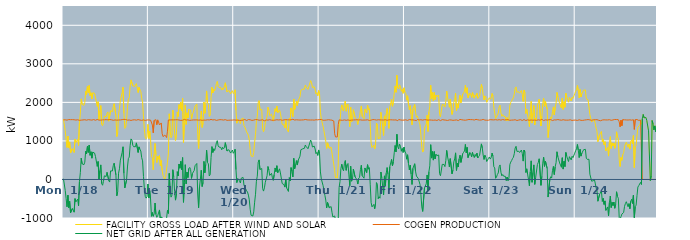
| Category | FACILITY GROSS LOAD AFTER WIND AND SOLAR | COGEN PRODUCTION | NET GRID AFTER ALL GENERATION |
|---|---|---|---|
|  Mon  1/18 | 1564 | 1546 | 18 |
|  Mon  1/18 | 1580 | 1552 | 28 |
|  Mon  1/18 | 1264 | 1547 | -283 |
|  Mon  1/18 | 1041 | 1535 | -494 |
|  Mon  1/18 | 830 | 1539 | -709 |
|  Mon  1/18 | 1127 | 1534 | -407 |
|  Mon  1/18 | 820 | 1554 | -734 |
|  Mon  1/18 | 974 | 1543 | -569 |
|  Mon  1/18 | 685 | 1551 | -866 |
|  Mon  1/18 | 693 | 1546 | -853 |
|  Mon  1/18 | 798 | 1552 | -754 |
|  Mon  1/18 | 811 | 1551 | -740 |
|  Mon  1/18 | 700 | 1549 | -849 |
|  Mon  1/18 | 1042 | 1539 | -497 |
|  Mon  1/18 | 962 | 1541 | -579 |
|  Mon  1/18 | 947 | 1542 | -595 |
|  Mon  1/18 | 1037 | 1548 | -511 |
|  Mon  1/18 | 882 | 1566 | -684 |
|  Mon  1/18 | 1479 | 1534 | -55 |
|  Mon  1/18 | 1721 | 1544 | 177 |
|  Mon  1/18 | 2091 | 1539 | 552 |
|  Mon  1/18 | 1954 | 1548 | 406 |
|  Mon  1/18 | 1949 | 1544 | 405 |
|  Mon  1/18 | 1921 | 1539 | 382 |
|  Mon  1/18 | 1998 | 1549 | 449 |
|  Mon  1/18 | 2291 | 1559 | 732 |
|  Mon  1/18 | 2206 | 1538 | 668 |
|  Mon  1/18 | 2412 | 1553 | 859 |
|  Mon  1/18 | 2252 | 1551 | 701 |
|  Mon  1/18 | 2441 | 1548 | 893 |
|  Mon  1/18 | 2171 | 1545 | 626 |
|  Mon  1/18 | 2249 | 1530 | 719 |
|  Mon  1/18 | 2092 | 1540 | 552 |
|  Mon  1/18 | 2248 | 1538 | 710 |
|  Mon  1/18 | 2256 | 1553 | 703 |
|  Mon  1/18 | 2234 | 1549 | 685 |
|  Mon  1/18 | 2134 | 1536 | 598 |
|  Mon  1/18 | 2120 | 1543 | 577 |
|  Mon  1/18 | 1896 | 1556 | 340 |
|  Mon  1/18 | 2016 | 1551 | 465 |
|  Mon  1/18 | 1550 | 1539 | 11 |
|  Mon  1/18 | 1777 | 1545 | 232 |
|  Mon  1/18 | 1917 | 1539 | 378 |
|  Mon  1/18 | 1432 | 1538 | -106 |
|  Mon  1/18 | 1395 | 1545 | -150 |
|  Mon  1/18 | 1483 | 1533 | -50 |
|  Mon  1/18 | 1642 | 1548 | 94 |
|  Mon  1/18 | 1631 | 1539 | 92 |
|  Mon  1/18 | 1628 | 1551 | 77 |
|  Mon  1/18 | 1715 | 1530 | 185 |
|  Mon  1/18 | 1752 | 1546 | 206 |
|  Mon  1/18 | 1511 | 1541 | -30 |
|  Mon  1/18 | 1487 | 1555 | -68 |
|  Mon  1/18 | 1785 | 1563 | 222 |
|  Mon  1/18 | 1769 | 1548 | 221 |
|  Mon  1/18 | 1756 | 1537 | 219 |
|  Mon  1/18 | 1890 | 1535 | 355 |
|  Mon  1/18 | 1966 | 1544 | 422 |
|  Mon  1/18 | 1977 | 1544 | 433 |
|  Mon  1/18 | 1655 | 1536 | 119 |
|  Mon  1/18 | 1113 | 1538 | -425 |
|  Mon  1/18 | 1227 | 1546 | -319 |
|  Mon  1/18 | 1704 | 1542 | 162 |
|  Mon  1/18 | 1835 | 1558 | 277 |
|  Mon  1/18 | 2045 | 1544 | 501 |
|  Mon  1/18 | 2049 | 1539 | 510 |
|  Mon  1/18 | 2251 | 1551 | 700 |
|  Mon  1/18 | 2395 | 1547 | 848 |
|  Mon  1/18 | 1717 | 1559 | 158 |
|  Mon  1/18 | 1324 | 1544 | -220 |
|  Mon  1/18 | 1353 | 1555 | -202 |
|  Mon  1/18 | 1529 | 1539 | -10 |
|  Mon  1/18 | 1863 | 1539 | 324 |
|  Mon  1/18 | 2084 | 1543 | 541 |
|  Mon  1/18 | 2123 | 1543 | 580 |
|  Mon  1/18 | 2427 | 1549 | 878 |
|  Mon  1/18 | 2583 | 1531 | 1052 |
|  Mon  1/18 | 2564 | 1541 | 1023 |
|  Mon  1/18 | 2430 | 1544 | 886 |
|  Mon  1/18 | 2410 | 1561 | 849 |
|  Mon  1/18 | 2411 | 1548 | 863 |
|  Mon  1/18 | 2401 | 1551 | 850 |
|  Mon  1/18 | 2487 | 1538 | 949 |
|  Mon  1/18 | 2469 | 1542 | 927 |
|  Mon  1/18 | 2254 | 1553 | 701 |
|  Mon  1/18 | 2390 | 1545 | 845 |
|  Mon  1/18 | 2321 | 1541 | 780 |
|  Mon  1/18 | 2283 | 1545 | 738 |
|  Mon  1/18 | 2100 | 1534 | 566 |
|  Mon  1/18 | 2013 | 1531 | 482 |
|  Mon  1/18 | 1624 | 1545 | 79 |
|  Mon  1/18 | 1299 | 1540 | -241 |
|  Mon  1/18 | 1092 | 1532 | -440 |
|  Mon  1/18 | 1056 | 1541 | -485 |
|  Mon  1/18 | 1098 | 1543 | -445 |
|  Mon  1/18 | 1429 | 1547 | -118 |
|  Tue  1/19 | 1063 | 1544 | -481 |
|  Tue  1/19 | 1255 | 1547 | -292 |
|  Tue  1/19 | 1011 | 1538 | -527 |
|  Tue  1/19 | 592 | 1548 | -956 |
|  Tue  1/19 | 554 | 1412 | -858 |
|  Tue  1/19 | 255 | 1211 | -956 |
|  Tue  1/19 | 641 | 1532 | -891 |
|  Tue  1/19 | 934 | 1545 | -611 |
|  Tue  1/19 | 646 | 1551 | -905 |
|  Tue  1/19 | 439 | 1421 | -982 |
|  Tue  1/19 | 606 | 1546 | -940 |
|  Tue  1/19 | 525 | 1490 | -965 |
|  Tue  1/19 | 622 | 1413 | -791 |
|  Tue  1/19 | 358 | 1408 | -1050 |
|  Tue  1/19 | 492 | 1466 | -974 |
|  Tue  1/19 | 231 | 1191 | -960 |
|  Tue  1/19 | 99 | 1111 | -1012 |
|  Tue  1/19 | 82 | 1092 | -1010 |
|  Tue  1/19 | -5 | 1152 | -1157 |
|  Tue  1/19 | 82 | 1123 | -1041 |
|  Tue  1/19 | 92 | 1088 | -996 |
|  Tue  1/19 | 450 | 1251 | -801 |
|  Tue  1/19 | 662 | 1543 | -881 |
|  Tue  1/19 | 1703 | 1546 | 157 |
|  Tue  1/19 | 1265 | 1544 | -279 |
|  Tue  1/19 | 1084 | 1543 | -459 |
|  Tue  1/19 | 1136 | 1545 | -409 |
|  Tue  1/19 | 1800 | 1548 | 252 |
|  Tue  1/19 | 1614 | 1545 | 69 |
|  Tue  1/19 | 1229 | 1537 | -308 |
|  Tue  1/19 | 1011 | 1548 | -537 |
|  Tue  1/19 | 1175 | 1552 | -377 |
|  Tue  1/19 | 1752 | 1549 | 203 |
|  Tue  1/19 | 1634 | 1543 | 91 |
|  Tue  1/19 | 1943 | 1542 | 401 |
|  Tue  1/19 | 1832 | 1541 | 291 |
|  Tue  1/19 | 2003 | 1532 | 471 |
|  Tue  1/19 | 1784 | 1531 | 253 |
|  Tue  1/19 | 2104 | 1537 | 567 |
|  Tue  1/19 | 957 | 1550 | -593 |
|  Tue  1/19 | 1468 | 1558 | -90 |
|  Tue  1/19 | 1934 | 1551 | 383 |
|  Tue  1/19 | 1428 | 1541 | -113 |
|  Tue  1/19 | 1730 | 1539 | 191 |
|  Tue  1/19 | 1595 | 1546 | 49 |
|  Tue  1/19 | 1822 | 1540 | 282 |
|  Tue  1/19 | 1843 | 1532 | 311 |
|  Tue  1/19 | 1803 | 1545 | 258 |
|  Tue  1/19 | 1565 | 1538 | 27 |
|  Tue  1/19 | 1691 | 1543 | 148 |
|  Tue  1/19 | 1739 | 1544 | 195 |
|  Tue  1/19 | 1753 | 1524 | 229 |
|  Tue  1/19 | 1901 | 1544 | 357 |
|  Tue  1/19 | 1910 | 1539 | 371 |
|  Tue  1/19 | 1959 | 1545 | 414 |
|  Tue  1/19 | 1171 | 1549 | -378 |
|  Tue  1/19 | 804 | 1538 | -734 |
|  Tue  1/19 | 1339 | 1534 | -195 |
|  Tue  1/19 | 1553 | 1543 | 10 |
|  Tue  1/19 | 1777 | 1539 | 238 |
|  Tue  1/19 | 1351 | 1534 | -183 |
|  Tue  1/19 | 1457 | 1536 | -79 |
|  Tue  1/19 | 2009 | 1540 | 469 |
|  Tue  1/19 | 1715 | 1542 | 173 |
|  Tue  1/19 | 1930 | 1538 | 392 |
|  Tue  1/19 | 2297 | 1537 | 760 |
|  Tue  1/19 | 1990 | 1548 | 442 |
|  Tue  1/19 | 1951 | 1549 | 402 |
|  Tue  1/19 | 1634 | 1543 | 91 |
|  Tue  1/19 | 1669 | 1545 | 124 |
|  Tue  1/19 | 2123 | 1557 | 566 |
|  Tue  1/19 | 2398 | 1546 | 852 |
|  Tue  1/19 | 2244 | 1544 | 700 |
|  Tue  1/19 | 2339 | 1543 | 796 |
|  Tue  1/19 | 2301 | 1550 | 751 |
|  Tue  1/19 | 2375 | 1541 | 834 |
|  Tue  1/19 | 2486 | 1533 | 953 |
|  Tue  1/19 | 2545 | 1539 | 1006 |
|  Tue  1/19 | 2414 | 1543 | 871 |
|  Tue  1/19 | 2382 | 1542 | 840 |
|  Tue  1/19 | 2388 | 1551 | 837 |
|  Tue  1/19 | 2386 | 1555 | 831 |
|  Tue  1/19 | 2319 | 1549 | 770 |
|  Tue  1/19 | 2369 | 1534 | 835 |
|  Tue  1/19 | 2337 | 1541 | 796 |
|  Tue  1/19 | 2358 | 1535 | 823 |
|  Tue  1/19 | 2508 | 1552 | 956 |
|  Tue  1/19 | 2514 | 1558 | 956 |
|  Tue  1/19 | 2271 | 1534 | 737 |
|  Tue  1/19 | 2266 | 1554 | 712 |
|  Tue  1/19 | 2309 | 1537 | 772 |
|  Tue  1/19 | 2303 | 1543 | 760 |
|  Tue  1/19 | 2224 | 1539 | 685 |
|  Tue  1/19 | 2268 | 1545 | 723 |
|  Tue  1/19 | 2303 | 1540 | 763 |
|  Tue  1/19 | 2228 | 1549 | 679 |
|  Wed  1/20 | 2260 | 1545 | 715 |
|  Wed  1/20 | 2326 | 1542 | 784 |
|  Wed  1/20 | 1794 | 1539 | 255 |
|  Wed  1/20 | 1458 | 1540 | -82 |
|  Wed  1/20 | 1561 | 1539 | 22 |
|  Wed  1/20 | 1586 | 1556 | 30 |
|  Wed  1/20 | 1496 | 1533 | -37 |
|  Wed  1/20 | 1446 | 1538 | -92 |
|  Wed  1/20 | 1566 | 1532 | 34 |
|  Wed  1/20 | 1584 | 1544 | 40 |
|  Wed  1/20 | 1593 | 1540 | 53 |
|  Wed  1/20 | 1392 | 1537 | -145 |
|  Wed  1/20 | 1361 | 1556 | -195 |
|  Wed  1/20 | 1366 | 1554 | -188 |
|  Wed  1/20 | 1233 | 1529 | -296 |
|  Wed  1/20 | 1210 | 1537 | -327 |
|  Wed  1/20 | 1147 | 1553 | -406 |
|  Wed  1/20 | 1026 | 1553 | -527 |
|  Wed  1/20 | 776 | 1548 | -772 |
|  Wed  1/20 | 614 | 1542 | -928 |
|  Wed  1/20 | 616 | 1532 | -916 |
|  Wed  1/20 | 590 | 1538 | -948 |
|  Wed  1/20 | 699 | 1540 | -841 |
|  Wed  1/20 | 970 | 1560 | -590 |
|  Wed  1/20 | 1171 | 1554 | -383 |
|  Wed  1/20 | 1499 | 1544 | -45 |
|  Wed  1/20 | 1635 | 1551 | 84 |
|  Wed  1/20 | 1989 | 1544 | 445 |
|  Wed  1/20 | 2044 | 1537 | 507 |
|  Wed  1/20 | 1801 | 1543 | 258 |
|  Wed  1/20 | 1803 | 1540 | 263 |
|  Wed  1/20 | 1820 | 1536 | 284 |
|  Wed  1/20 | 1311 | 1548 | -237 |
|  Wed  1/20 | 1237 | 1539 | -302 |
|  Wed  1/20 | 1304 | 1522 | -218 |
|  Wed  1/20 | 1470 | 1545 | -75 |
|  Wed  1/20 | 1455 | 1544 | -89 |
|  Wed  1/20 | 1635 | 1537 | 98 |
|  Wed  1/20 | 1874 | 1539 | 335 |
|  Wed  1/20 | 1793 | 1549 | 244 |
|  Wed  1/20 | 1653 | 1550 | 103 |
|  Wed  1/20 | 1631 | 1544 | 87 |
|  Wed  1/20 | 1695 | 1537 | 158 |
|  Wed  1/20 | 1582 | 1539 | 43 |
|  Wed  1/20 | 1513 | 1535 | -22 |
|  Wed  1/20 | 1671 | 1543 | 128 |
|  Wed  1/20 | 1838 | 1540 | 298 |
|  Wed  1/20 | 1759 | 1556 | 203 |
|  Wed  1/20 | 1905 | 1549 | 356 |
|  Wed  1/20 | 1729 | 1557 | 172 |
|  Wed  1/20 | 1737 | 1543 | 194 |
|  Wed  1/20 | 1804 | 1528 | 276 |
|  Wed  1/20 | 1718 | 1549 | 169 |
|  Wed  1/20 | 1706 | 1548 | 158 |
|  Wed  1/20 | 1430 | 1535 | -105 |
|  Wed  1/20 | 1440 | 1536 | -96 |
|  Wed  1/20 | 1410 | 1545 | -135 |
|  Wed  1/20 | 1338 | 1536 | -198 |
|  Wed  1/20 | 1555 | 1552 | 3 |
|  Wed  1/20 | 1322 | 1542 | -220 |
|  Wed  1/20 | 1325 | 1547 | -222 |
|  Wed  1/20 | 1229 | 1541 | -312 |
|  Wed  1/20 | 1593 | 1545 | 48 |
|  Wed  1/20 | 1520 | 1554 | -34 |
|  Wed  1/20 | 1855 | 1548 | 307 |
|  Wed  1/20 | 1765 | 1548 | 217 |
|  Wed  1/20 | 1626 | 1561 | 65 |
|  Wed  1/20 | 2088 | 1541 | 547 |
|  Wed  1/20 | 1817 | 1541 | 276 |
|  Wed  1/20 | 1915 | 1543 | 372 |
|  Wed  1/20 | 2036 | 1548 | 488 |
|  Wed  1/20 | 1917 | 1543 | 374 |
|  Wed  1/20 | 2041 | 1544 | 497 |
|  Wed  1/20 | 2044 | 1535 | 509 |
|  Wed  1/20 | 2145 | 1541 | 604 |
|  Wed  1/20 | 2314 | 1543 | 771 |
|  Wed  1/20 | 2319 | 1543 | 776 |
|  Wed  1/20 | 2340 | 1546 | 794 |
|  Wed  1/20 | 2347 | 1545 | 802 |
|  Wed  1/20 | 2344 | 1535 | 809 |
|  Wed  1/20 | 2449 | 1556 | 893 |
|  Wed  1/20 | 2401 | 1548 | 853 |
|  Wed  1/20 | 2422 | 1545 | 877 |
|  Wed  1/20 | 2337 | 1540 | 797 |
|  Wed  1/20 | 2412 | 1543 | 869 |
|  Wed  1/20 | 2413 | 1532 | 881 |
|  Wed  1/20 | 2564 | 1542 | 1022 |
|  Wed  1/20 | 2513 | 1551 | 962 |
|  Wed  1/20 | 2385 | 1543 | 842 |
|  Wed  1/20 | 2375 | 1543 | 832 |
|  Wed  1/20 | 2404 | 1539 | 865 |
|  Wed  1/20 | 2331 | 1540 | 791 |
|  Wed  1/20 | 2218 | 1549 | 669 |
|  Wed  1/20 | 2251 | 1549 | 702 |
|  Wed  1/20 | 2170 | 1546 | 624 |
|  Wed  1/20 | 2306 | 1541 | 765 |
|  Thu  1/21 | 2223 | 1555 | 668 |
|  Thu  1/21 | 1744 | 1550 | 194 |
|  Thu  1/21 | 1569 | 1555 | 14 |
|  Thu  1/21 | 1576 | 1547 | 29 |
|  Thu  1/21 | 1374 | 1536 | -162 |
|  Thu  1/21 | 1258 | 1539 | -281 |
|  Thu  1/21 | 1126 | 1537 | -411 |
|  Thu  1/21 | 995 | 1529 | -534 |
|  Thu  1/21 | 805 | 1542 | -737 |
|  Thu  1/21 | 950 | 1546 | -596 |
|  Thu  1/21 | 938 | 1550 | -612 |
|  Thu  1/21 | 811 | 1547 | -736 |
|  Thu  1/21 | 807 | 1543 | -736 |
|  Thu  1/21 | 837 | 1540 | -703 |
|  Thu  1/21 | 687 | 1538 | -851 |
|  Thu  1/21 | 540 | 1514 | -974 |
|  Thu  1/21 | 555 | 1515 | -960 |
|  Thu  1/21 | 238 | 1185 | -947 |
|  Thu  1/21 | 41 | 1102 | -1061 |
|  Thu  1/21 | 70 | 1096 | -1026 |
|  Thu  1/21 | 32 | 1103 | -1071 |
|  Thu  1/21 | 377 | 1420 | -1043 |
|  Thu  1/21 | 1336 | 1546 | -210 |
|  Thu  1/21 | 1482 | 1539 | -57 |
|  Thu  1/21 | 1815 | 1538 | 277 |
|  Thu  1/21 | 1934 | 1539 | 395 |
|  Thu  1/21 | 1805 | 1535 | 270 |
|  Thu  1/21 | 1774 | 1550 | 224 |
|  Thu  1/21 | 1966 | 1546 | 420 |
|  Thu  1/21 | 2035 | 1545 | 490 |
|  Thu  1/21 | 1771 | 1534 | 237 |
|  Thu  1/21 | 1933 | 1554 | 379 |
|  Thu  1/21 | 1959 | 1545 | 414 |
|  Thu  1/21 | 1654 | 1536 | 118 |
|  Thu  1/21 | 1370 | 1533 | -163 |
|  Thu  1/21 | 1880 | 1538 | 342 |
|  Thu  1/21 | 1494 | 1540 | -46 |
|  Thu  1/21 | 1545 | 1550 | -5 |
|  Thu  1/21 | 1812 | 1543 | 269 |
|  Thu  1/21 | 1826 | 1548 | 278 |
|  Thu  1/21 | 1611 | 1545 | 66 |
|  Thu  1/21 | 1592 | 1540 | 52 |
|  Thu  1/21 | 1542 | 1549 | -7 |
|  Thu  1/21 | 1427 | 1546 | -119 |
|  Thu  1/21 | 1571 | 1543 | 28 |
|  Thu  1/21 | 1610 | 1556 | 54 |
|  Thu  1/21 | 1806 | 1546 | 260 |
|  Thu  1/21 | 1907 | 1540 | 367 |
|  Thu  1/21 | 1633 | 1538 | 95 |
|  Thu  1/21 | 1614 | 1541 | 73 |
|  Thu  1/21 | 1573 | 1541 | 32 |
|  Thu  1/21 | 1826 | 1528 | 298 |
|  Thu  1/21 | 1847 | 1542 | 305 |
|  Thu  1/21 | 1722 | 1543 | 179 |
|  Thu  1/21 | 1931 | 1548 | 383 |
|  Thu  1/21 | 1802 | 1535 | 267 |
|  Thu  1/21 | 1838 | 1531 | 307 |
|  Thu  1/21 | 1412 | 1536 | -124 |
|  Thu  1/21 | 941 | 1539 | -598 |
|  Thu  1/21 | 828 | 1539 | -711 |
|  Thu  1/21 | 838 | 1553 | -715 |
|  Thu  1/21 | 889 | 1537 | -648 |
|  Thu  1/21 | 789 | 1550 | -761 |
|  Thu  1/21 | 916 | 1529 | -613 |
|  Thu  1/21 | 1460 | 1540 | -80 |
|  Thu  1/21 | 1413 | 1535 | -122 |
|  Thu  1/21 | 1051 | 1548 | -497 |
|  Thu  1/21 | 1091 | 1541 | -450 |
|  Thu  1/21 | 1059 | 1545 | -486 |
|  Thu  1/21 | 1743 | 1550 | 193 |
|  Thu  1/21 | 1584 | 1543 | 41 |
|  Thu  1/21 | 1574 | 1540 | 34 |
|  Thu  1/21 | 1142 | 1542 | -400 |
|  Thu  1/21 | 1649 | 1556 | 93 |
|  Thu  1/21 | 1387 | 1550 | -163 |
|  Thu  1/21 | 1698 | 1537 | 161 |
|  Thu  1/21 | 1843 | 1535 | 308 |
|  Thu  1/21 | 1684 | 1553 | 131 |
|  Thu  1/21 | 1324 | 1546 | -222 |
|  Thu  1/21 | 1874 | 1545 | 329 |
|  Thu  1/21 | 1859 | 1548 | 311 |
|  Thu  1/21 | 2075 | 1556 | 519 |
|  Thu  1/21 | 1899 | 1545 | 354 |
|  Thu  1/21 | 1996 | 1534 | 462 |
|  Thu  1/21 | 2236 | 1543 | 693 |
|  Thu  1/21 | 2426 | 1545 | 881 |
|  Thu  1/21 | 2261 | 1545 | 716 |
|  Thu  1/21 | 2702 | 1531 | 1171 |
|  Thu  1/21 | 2377 | 1523 | 854 |
|  Thu  1/21 | 2348 | 1555 | 793 |
|  Thu  1/21 | 2458 | 1543 | 915 |
|  Thu  1/21 | 2404 | 1544 | 860 |
|  Thu  1/21 | 2286 | 1553 | 733 |
|  Thu  1/21 | 2341 | 1538 | 803 |
|  Thu  1/21 | 2233 | 1534 | 699 |
|  Thu  1/21 | 2378 | 1540 | 838 |
|  Fri  1/22 | 2262 | 1545 | 717 |
|  Fri  1/22 | 2234 | 1547 | 687 |
|  Fri  1/22 | 2059 | 1533 | 526 |
|  Fri  1/22 | 2171 | 1531 | 640 |
|  Fri  1/22 | 1961 | 1544 | 417 |
|  Fri  1/22 | 1803 | 1555 | 248 |
|  Fri  1/22 | 1914 | 1544 | 370 |
|  Fri  1/22 | 1685 | 1546 | 139 |
|  Fri  1/22 | 1417 | 1547 | -130 |
|  Fri  1/22 | 1834 | 1545 | 289 |
|  Fri  1/22 | 1846 | 1540 | 306 |
|  Fri  1/22 | 1945 | 1537 | 408 |
|  Fri  1/22 | 1739 | 1534 | 205 |
|  Fri  1/22 | 1614 | 1527 | 87 |
|  Fri  1/22 | 1649 | 1555 | 94 |
|  Fri  1/22 | 1572 | 1545 | 27 |
|  Fri  1/22 | 1575 | 1544 | 31 |
|  Fri  1/22 | 1417 | 1548 | -131 |
|  Fri  1/22 | 1153 | 1549 | -396 |
|  Fri  1/22 | 826 | 1539 | -713 |
|  Fri  1/22 | 710 | 1539 | -829 |
|  Fri  1/22 | 738 | 1549 | -811 |
|  Fri  1/22 | 1329 | 1551 | -222 |
|  Fri  1/22 | 1341 | 1539 | -198 |
|  Fri  1/22 | 1433 | 1547 | -114 |
|  Fri  1/22 | 1665 | 1549 | 116 |
|  Fri  1/22 | 1245 | 1539 | -294 |
|  Fri  1/22 | 1754 | 1553 | 201 |
|  Fri  1/22 | 1896 | 1543 | 353 |
|  Fri  1/22 | 2445 | 1543 | 902 |
|  Fri  1/22 | 2094 | 1540 | 554 |
|  Fri  1/22 | 2257 | 1533 | 724 |
|  Fri  1/22 | 2038 | 1536 | 502 |
|  Fri  1/22 | 2257 | 1533 | 724 |
|  Fri  1/22 | 2074 | 1542 | 532 |
|  Fri  1/22 | 2191 | 1539 | 652 |
|  Fri  1/22 | 2152 | 1531 | 621 |
|  Fri  1/22 | 2151 | 1546 | 605 |
|  Fri  1/22 | 2185 | 1552 | 633 |
|  Fri  1/22 | 1681 | 1533 | 148 |
|  Fri  1/22 | 1624 | 1527 | 97 |
|  Fri  1/22 | 1648 | 1541 | 107 |
|  Fri  1/22 | 1944 | 1552 | 392 |
|  Fri  1/22 | 1949 | 1540 | 409 |
|  Fri  1/22 | 1932 | 1544 | 388 |
|  Fri  1/22 | 1877 | 1544 | 333 |
|  Fri  1/22 | 2028 | 1539 | 489 |
|  Fri  1/22 | 2293 | 1540 | 753 |
|  Fri  1/22 | 2118 | 1531 | 587 |
|  Fri  1/22 | 2012 | 1538 | 474 |
|  Fri  1/22 | 1873 | 1545 | 328 |
|  Fri  1/22 | 2086 | 1546 | 540 |
|  Fri  1/22 | 2074 | 1543 | 531 |
|  Fri  1/22 | 1688 | 1541 | 147 |
|  Fri  1/22 | 1775 | 1534 | 241 |
|  Fri  1/22 | 2005 | 1548 | 457 |
|  Fri  1/22 | 2070 | 1538 | 532 |
|  Fri  1/22 | 2236 | 1546 | 690 |
|  Fri  1/22 | 1779 | 1545 | 234 |
|  Fri  1/22 | 1962 | 1537 | 425 |
|  Fri  1/22 | 1851 | 1528 | 323 |
|  Fri  1/22 | 2074 | 1540 | 534 |
|  Fri  1/22 | 2187 | 1558 | 629 |
|  Fri  1/22 | 1991 | 1549 | 442 |
|  Fri  1/22 | 1991 | 1548 | 443 |
|  Fri  1/22 | 2214 | 1545 | 669 |
|  Fri  1/22 | 2244 | 1541 | 703 |
|  Fri  1/22 | 2293 | 1553 | 740 |
|  Fri  1/22 | 2445 | 1537 | 908 |
|  Fri  1/22 | 2237 | 1545 | 692 |
|  Fri  1/22 | 2379 | 1546 | 833 |
|  Fri  1/22 | 2117 | 1550 | 567 |
|  Fri  1/22 | 2136 | 1556 | 580 |
|  Fri  1/22 | 2242 | 1544 | 698 |
|  Fri  1/22 | 2207 | 1552 | 655 |
|  Fri  1/22 | 2131 | 1545 | 586 |
|  Fri  1/22 | 2253 | 1551 | 702 |
|  Fri  1/22 | 2264 | 1541 | 723 |
|  Fri  1/22 | 2109 | 1542 | 567 |
|  Fri  1/22 | 2194 | 1543 | 651 |
|  Fri  1/22 | 2154 | 1559 | 595 |
|  Fri  1/22 | 2237 | 1553 | 684 |
|  Fri  1/22 | 2105 | 1548 | 557 |
|  Fri  1/22 | 2135 | 1538 | 597 |
|  Fri  1/22 | 2168 | 1540 | 628 |
|  Fri  1/22 | 2171 | 1532 | 639 |
|  Fri  1/22 | 2466 | 1543 | 923 |
|  Fri  1/22 | 2374 | 1554 | 820 |
|  Fri  1/22 | 2192 | 1558 | 634 |
|  Fri  1/22 | 2061 | 1542 | 519 |
|  Fri  1/22 | 2168 | 1540 | 628 |
|  Fri  1/22 | 2135 | 1555 | 580 |
|  Fri  1/22 | 2002 | 1537 | 465 |
|  Fri  1/22 | 1986 | 1543 | 443 |
|  Fri  1/22 | 2083 | 1537 | 546 |
|  Fri  1/22 | 2120 | 1537 | 583 |
|  Sat  1/23 | 2080 | 1551 | 529 |
|  Sat  1/23 | 2114 | 1546 | 568 |
|  Sat  1/23 | 2231 | 1547 | 684 |
|  Sat  1/23 | 2162 | 1558 | 604 |
|  Sat  1/23 | 1873 | 1545 | 328 |
|  Sat  1/23 | 1850 | 1550 | 300 |
|  Sat  1/23 | 1581 | 1551 | 30 |
|  Sat  1/23 | 1603 | 1540 | 63 |
|  Sat  1/23 | 1670 | 1541 | 129 |
|  Sat  1/23 | 1724 | 1555 | 169 |
|  Sat  1/23 | 1883 | 1551 | 332 |
|  Sat  1/23 | 1926 | 1549 | 377 |
|  Sat  1/23 | 1724 | 1539 | 185 |
|  Sat  1/23 | 1638 | 1544 | 94 |
|  Sat  1/23 | 1682 | 1555 | 127 |
|  Sat  1/23 | 1639 | 1554 | 85 |
|  Sat  1/23 | 1635 | 1543 | 92 |
|  Sat  1/23 | 1627 | 1547 | 80 |
|  Sat  1/23 | 1521 | 1550 | -29 |
|  Sat  1/23 | 1606 | 1543 | 63 |
|  Sat  1/23 | 1520 | 1551 | -31 |
|  Sat  1/23 | 1583 | 1541 | 42 |
|  Sat  1/23 | 1921 | 1535 | 386 |
|  Sat  1/23 | 1999 | 1549 | 450 |
|  Sat  1/23 | 2030 | 1540 | 490 |
|  Sat  1/23 | 2083 | 1542 | 541 |
|  Sat  1/23 | 2117 | 1542 | 575 |
|  Sat  1/23 | 2213 | 1546 | 667 |
|  Sat  1/23 | 2364 | 1549 | 815 |
|  Sat  1/23 | 2401 | 1541 | 860 |
|  Sat  1/23 | 2257 | 1530 | 727 |
|  Sat  1/23 | 2284 | 1543 | 741 |
|  Sat  1/23 | 2273 | 1541 | 732 |
|  Sat  1/23 | 2243 | 1544 | 699 |
|  Sat  1/23 | 2233 | 1551 | 682 |
|  Sat  1/23 | 2309 | 1546 | 763 |
|  Sat  1/23 | 2202 | 1530 | 672 |
|  Sat  1/23 | 2025 | 1549 | 476 |
|  Sat  1/23 | 2319 | 1555 | 764 |
|  Sat  1/23 | 2253 | 1544 | 709 |
|  Sat  1/23 | 1710 | 1529 | 181 |
|  Sat  1/23 | 1822 | 1546 | 276 |
|  Sat  1/23 | 1677 | 1546 | 131 |
|  Sat  1/23 | 1548 | 1544 | 4 |
|  Sat  1/23 | 1373 | 1537 | -164 |
|  Sat  1/23 | 1746 | 1549 | 197 |
|  Sat  1/23 | 2025 | 1542 | 483 |
|  Sat  1/23 | 1463 | 1536 | -73 |
|  Sat  1/23 | 1718 | 1537 | 181 |
|  Sat  1/23 | 1917 | 1539 | 378 |
|  Sat  1/23 | 1413 | 1540 | -127 |
|  Sat  1/23 | 1593 | 1549 | 44 |
|  Sat  1/23 | 1555 | 1533 | 22 |
|  Sat  1/23 | 1934 | 1548 | 386 |
|  Sat  1/23 | 1991 | 1548 | 443 |
|  Sat  1/23 | 2083 | 1547 | 536 |
|  Sat  1/23 | 2064 | 1537 | 527 |
|  Sat  1/23 | 1388 | 1540 | -152 |
|  Sat  1/23 | 1642 | 1560 | 82 |
|  Sat  1/23 | 1967 | 1544 | 423 |
|  Sat  1/23 | 2105 | 1528 | 577 |
|  Sat  1/23 | 1890 | 1551 | 339 |
|  Sat  1/23 | 2024 | 1546 | 478 |
|  Sat  1/23 | 2046 | 1546 | 500 |
|  Sat  1/23 | 1824 | 1540 | 284 |
|  Sat  1/23 | 1087 | 1543 | -456 |
|  Sat  1/23 | 1086 | 1548 | -462 |
|  Sat  1/23 | 1541 | 1531 | 10 |
|  Sat  1/23 | 1623 | 1552 | 71 |
|  Sat  1/23 | 1582 | 1547 | 35 |
|  Sat  1/23 | 1765 | 1528 | 237 |
|  Sat  1/23 | 1883 | 1546 | 337 |
|  Sat  1/23 | 1673 | 1546 | 127 |
|  Sat  1/23 | 1874 | 1544 | 330 |
|  Sat  1/23 | 1978 | 1543 | 435 |
|  Sat  1/23 | 2258 | 1540 | 718 |
|  Sat  1/23 | 2142 | 1554 | 588 |
|  Sat  1/23 | 2144 | 1551 | 593 |
|  Sat  1/23 | 1972 | 1544 | 428 |
|  Sat  1/23 | 1986 | 1550 | 436 |
|  Sat  1/23 | 1854 | 1537 | 317 |
|  Sat  1/23 | 2110 | 1546 | 564 |
|  Sat  1/23 | 1818 | 1549 | 269 |
|  Sat  1/23 | 2018 | 1546 | 472 |
|  Sat  1/23 | 1873 | 1540 | 333 |
|  Sat  1/23 | 2237 | 1537 | 700 |
|  Sat  1/23 | 2141 | 1538 | 603 |
|  Sat  1/23 | 2067 | 1543 | 524 |
|  Sat  1/23 | 2004 | 1539 | 465 |
|  Sat  1/23 | 2126 | 1535 | 591 |
|  Sat  1/23 | 2131 | 1548 | 583 |
|  Sat  1/23 | 2035 | 1528 | 507 |
|  Sat  1/23 | 2132 | 1530 | 602 |
|  Sat  1/23 | 2104 | 1537 | 567 |
|  Sat  1/23 | 2112 | 1539 | 573 |
|  Sat  1/23 | 2223 | 1541 | 682 |
|  Sun  1/24 | 2285 | 1540 | 745 |
|  Sun  1/24 | 2335 | 1540 | 795 |
|  Sun  1/24 | 2439 | 1531 | 908 |
|  Sun  1/24 | 2304 | 1549 | 755 |
|  Sun  1/24 | 2116 | 1548 | 568 |
|  Sun  1/24 | 2331 | 1550 | 781 |
|  Sun  1/24 | 2139 | 1534 | 605 |
|  Sun  1/24 | 2229 | 1546 | 683 |
|  Sun  1/24 | 2214 | 1533 | 681 |
|  Sun  1/24 | 2316 | 1544 | 772 |
|  Sun  1/24 | 2338 | 1541 | 797 |
|  Sun  1/24 | 2323 | 1542 | 781 |
|  Sun  1/24 | 2096 | 1547 | 549 |
|  Sun  1/24 | 2072 | 1550 | 522 |
|  Sun  1/24 | 2067 | 1553 | 514 |
|  Sun  1/24 | 2058 | 1535 | 523 |
|  Sun  1/24 | 1683 | 1545 | 138 |
|  Sun  1/24 | 1688 | 1546 | 142 |
|  Sun  1/24 | 1490 | 1535 | -45 |
|  Sun  1/24 | 1518 | 1545 | -27 |
|  Sun  1/24 | 1516 | 1548 | -32 |
|  Sun  1/24 | 1552 | 1542 | 10 |
|  Sun  1/24 | 1455 | 1549 | -94 |
|  Sun  1/24 | 1330 | 1546 | -216 |
|  Sun  1/24 | 1255 | 1551 | -296 |
|  Sun  1/24 | 980 | 1545 | -565 |
|  Sun  1/24 | 968 | 1535 | -567 |
|  Sun  1/24 | 1160 | 1540 | -380 |
|  Sun  1/24 | 1151 | 1523 | -372 |
|  Sun  1/24 | 1247 | 1548 | -301 |
|  Sun  1/24 | 972 | 1542 | -570 |
|  Sun  1/24 | 1046 | 1536 | -490 |
|  Sun  1/24 | 899 | 1547 | -648 |
|  Sun  1/24 | 981 | 1537 | -556 |
|  Sun  1/24 | 741 | 1544 | -803 |
|  Sun  1/24 | 789 | 1553 | -764 |
|  Sun  1/24 | 831 | 1544 | -713 |
|  Sun  1/24 | 606 | 1551 | -945 |
|  Sun  1/24 | 957 | 1550 | -593 |
|  Sun  1/24 | 1110 | 1540 | -430 |
|  Sun  1/24 | 805 | 1534 | -729 |
|  Sun  1/24 | 949 | 1542 | -593 |
|  Sun  1/24 | 867 | 1544 | -677 |
|  Sun  1/24 | 946 | 1534 | -588 |
|  Sun  1/24 | 809 | 1556 | -747 |
|  Sun  1/24 | 898 | 1543 | -645 |
|  Sun  1/24 | 1236 | 1555 | -319 |
|  Sun  1/24 | 1104 | 1544 | -440 |
|  Sun  1/24 | 1063 | 1551 | -488 |
|  Sun  1/24 | 510 | 1496 | -986 |
|  Sun  1/24 | 336 | 1366 | -1030 |
|  Sun  1/24 | 571 | 1538 | -967 |
|  Sun  1/24 | 497 | 1395 | -898 |
|  Sun  1/24 | 642 | 1552 | -910 |
|  Sun  1/24 | 697 | 1553 | -856 |
|  Sun  1/24 | 849 | 1547 | -698 |
|  Sun  1/24 | 921 | 1544 | -623 |
|  Sun  1/24 | 966 | 1544 | -578 |
|  Sun  1/24 | 987 | 1547 | -560 |
|  Sun  1/24 | 832 | 1542 | -710 |
|  Sun  1/24 | 918 | 1544 | -626 |
|  Sun  1/24 | 788 | 1546 | -758 |
|  Sun  1/24 | 985 | 1551 | -566 |
|  Sun  1/24 | 1025 | 1538 | -513 |
|  Sun  1/24 | 921 | 1545 | -624 |
|  Sun  1/24 | 1143 | 1549 | -406 |
|  Sun  1/24 | 307 | 1298 | -991 |
|  Sun  1/24 | 848 | 1552 | -704 |
|  Sun  1/24 | 883 | 1550 | -667 |
|  Sun  1/24 | 1134 | 1554 | -420 |
|  Sun  1/24 | 1354 | 1551 | -197 |
|  Sun  1/24 | 1373 | 1532 | -159 |
|  Sun  1/24 | 1408 | 1550 | -142 |
|  Sun  1/24 | 1466 | 1541 | -75 |
|  Sun  1/24 | 1432 | 1562 | -130 |
|  Sun  1/24 | 1574 | 0 | 1574 |
|  Sun  1/24 | 1685 | 0 | 1685 |
|  Sun  1/24 | 1599 | 0 | 1599 |
|  Sun  1/24 | 1607 | 0 | 1607 |
|  Sun  1/24 | 1608 | 0 | 1608 |
|  Sun  1/24 | 1532 | 0 | 1532 |
|  Sun  1/24 | 1548 | 0 | 1548 |
|  Sun  1/24 | 1261 | 0 | 1261 |
|  Sun  1/24 | 1237 | 0 | 1237 |
|  Sun  1/24 | -29 | 0 | -29 |
|  Sun  1/24 | 93 | 0 | 93 |
|  Sun  1/24 | 1529 | 0 | 1529 |
|  Sun  1/24 | 1445 | 0 | 1445 |
|  Sun  1/24 | 1286 | 0 | 1286 |
|  Sun  1/24 | 1389 | 0 | 1389 |
|  Sun  1/24 | 1237 | 0 | 1237 |
|  Sun  1/24 | 1421 | 0 | 1421 |